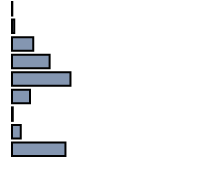
| Category | Series 0 |
|---|---|
| 0 | 0.152 |
| 1 | 1.061 |
| 2 | 10.606 |
| 3 | 18.712 |
| 4 | 29.091 |
| 5 | 9.015 |
| 6 | 0.379 |
| 7 | 4.394 |
| 8 | 26.591 |